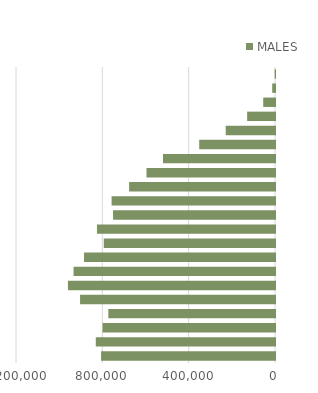
| Category |  MALES  |
|---|---|
| 100 + | -1432 |
| 95–99 | -12940 |
| 90–94 | -54604 |
| 85–89 | -129145 |
| 80–84 | -228349 |
| 75–79 | -351175 |
| 70–74 | -518915 |
| 65–69 | -595333 |
| 60–64 | -675896 |
| 55–59 | -757076 |
| 50–54 | -750310 |
| 45–49 | -824890 |
| 40–44 | -793232 |
| 35–39 | -884809 |
| 30–34 | -933330 |
| 25–29 | -959311 |
| 20–24 | -903135 |
| 15–19 | -772176 |
| 10–14 | -799055 |
| 5–9 | -830370 |
| 0–4 | -805824 |